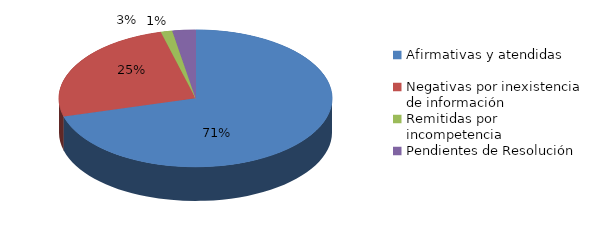
| Category | Series 0 |
|---|---|
| Afirmativas y atendidas | 104 |
| Negativas por inexistencia de información | 37 |
| Remitidas por incompetencia | 2 |
| Pendientes de Resolución | 4 |